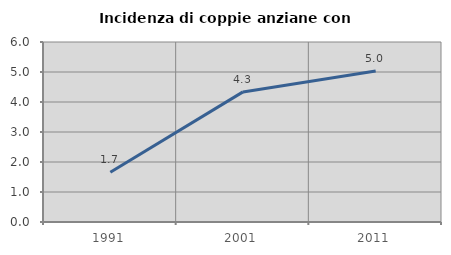
| Category | Incidenza di coppie anziane con figli |
|---|---|
| 1991.0 | 1.66 |
| 2001.0 | 4.336 |
| 2011.0 | 5.032 |